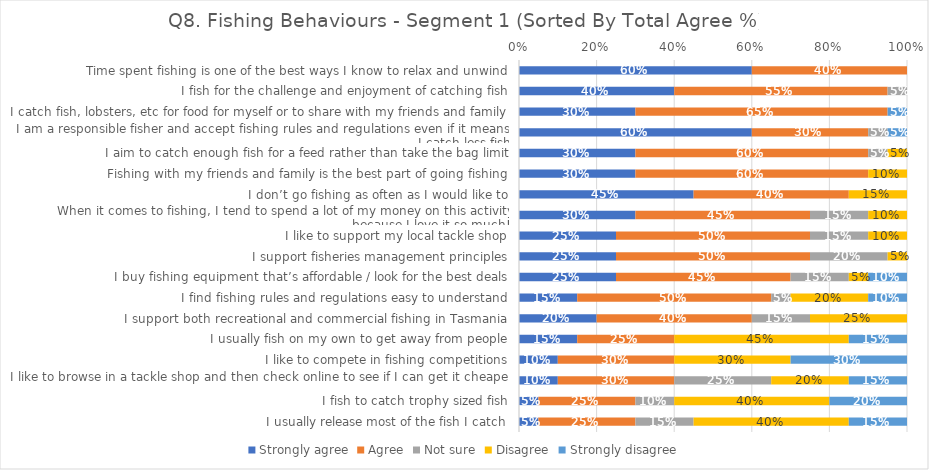
| Category | Strongly agree | Agree | Not sure | Disagree | Strongly disagree |
|---|---|---|---|---|---|
| Time spent fishing is one of the best ways I know to relax and unwind | 0.6 | 0.4 | 0 | 0 | 0 |
| I fish for the challenge and enjoyment of catching fish | 0.4 | 0.55 | 0.05 | 0 | 0 |
| I catch fish, lobsters, etc for food for myself or to share with my friends and family | 0.3 | 0.65 | 0 | 0 | 0.05 |
| I am a responsible fisher and accept fishing rules and regulations even if it means I catch less fish | 0.6 | 0.3 | 0.05 | 0 | 0.05 |
| I aim to catch enough fish for a feed rather than take the bag limit | 0.3 | 0.6 | 0.05 | 0.05 | 0 |
| Fishing with my friends and family is the best part of going fishing | 0.3 | 0.6 | 0 | 0.1 | 0 |
| I don’t go fishing as often as I would like to | 0.45 | 0.4 | 0 | 0.15 | 0 |
| When it comes to fishing, I tend to spend a lot of my money on this activity because I love it so much! | 0.3 | 0.45 | 0.15 | 0.1 | 0 |
| I like to support my local tackle shop | 0.25 | 0.5 | 0.15 | 0.1 | 0 |
| I support fisheries management principles | 0.25 | 0.5 | 0.2 | 0.05 | 0 |
| I buy fishing equipment that’s affordable / look for the best deals | 0.25 | 0.45 | 0.15 | 0.05 | 0.1 |
| I find fishing rules and regulations easy to understand | 0.15 | 0.5 | 0.05 | 0.2 | 0.1 |
| I support both recreational and commercial fishing in Tasmania | 0.2 | 0.4 | 0.15 | 0.25 | 0 |
| I usually fish on my own to get away from people | 0.15 | 0.25 | 0 | 0.45 | 0.15 |
| I like to compete in fishing competitions | 0.1 | 0.3 | 0 | 0.3 | 0.3 |
| I like to browse in a tackle shop and then check online to see if I can get it cheaper | 0.1 | 0.3 | 0.25 | 0.2 | 0.15 |
| I fish to catch trophy sized fish | 0.05 | 0.25 | 0.1 | 0.4 | 0.2 |
| I usually release most of the fish I catch | 0.05 | 0.25 | 0.15 | 0.4 | 0.15 |